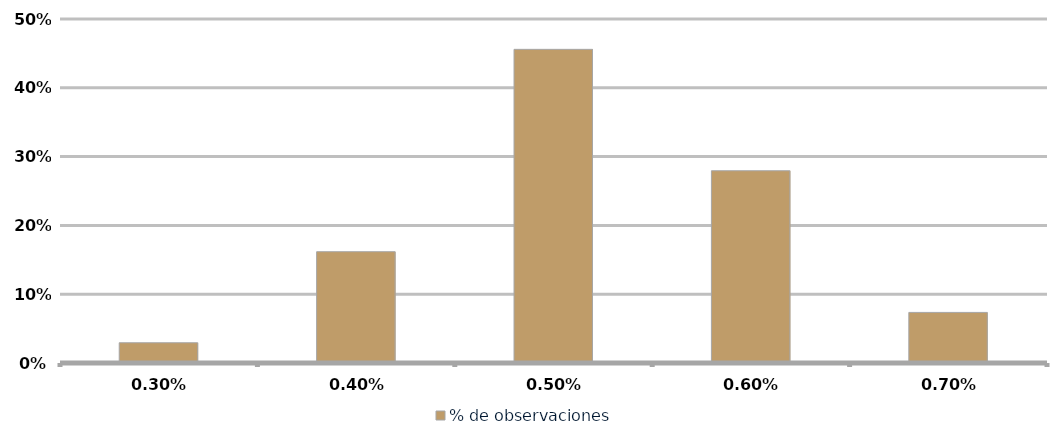
| Category | % de observaciones  |
|---|---|
| 0.003 | 0.029 |
| 0.004 | 0.162 |
| 0.005 | 0.456 |
| 0.006 | 0.279 |
| 0.007 | 0.074 |